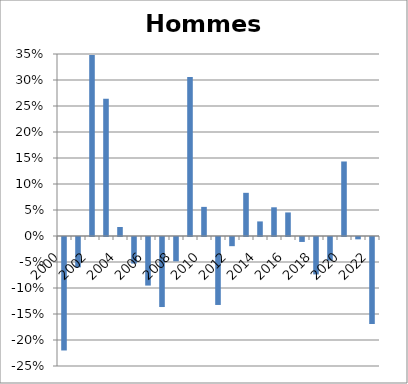
| Category | Hommes |
|---|---|
| 2000.0 | -0.218 |
| 2001.0 | -0.058 |
| 2002.0 | 0.348 |
| 2003.0 | 0.264 |
| 2004.0 | 0.017 |
| 2005.0 | -0.051 |
| 2006.0 | -0.093 |
| 2007.0 | -0.135 |
| 2008.0 | -0.047 |
| 2009.0 | 0.306 |
| 2010.0 | 0.056 |
| 2011.0 | -0.131 |
| 2012.0 | -0.018 |
| 2013.0 | 0.083 |
| 2014.0 | 0.028 |
| 2015.0 | 0.055 |
| 2016.0 | 0.045 |
| 2017.0 | -0.01 |
| 2018.0 | -0.072 |
| 2019.0 | -0.045 |
| 2020.0 | 0.143 |
| 2021.0 | -0.005 |
| 2022.0 | -0.167 |